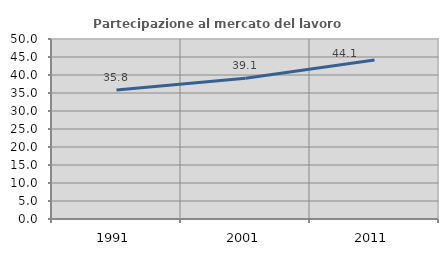
| Category | Partecipazione al mercato del lavoro  femminile |
|---|---|
| 1991.0 | 35.815 |
| 2001.0 | 39.087 |
| 2011.0 | 44.15 |